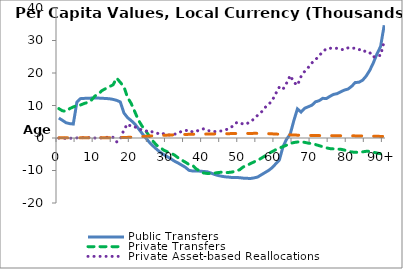
| Category | Public Transfers | Private Transfers | Private Asset-based Reallocations | Public Asset-based Reallocations |
|---|---|---|---|---|
| 0 | 6132.836 | 9041.562 | -36.174 | 38.028 |
|  | 5446.502 | 8375.056 | -2.334 | 40.225 |
| 2 | 4695.357 | 8206.972 | -160.194 | 42.548 |
| 3 | 4424.42 | 9032.658 | -80.09 | 45.016 |
| 4 | 4291.121 | 9559.871 | -36.107 | 47.719 |
| 5 | 11035.01 | 9991.024 | 34.15 | 50.623 |
| 6 | 12115.54 | 10165.3 | 90.466 | 53.706 |
| 7 | 12183.44 | 10608.65 | 118.781 | 56.86 |
| 8 | 12246.9 | 10949.73 | 105.192 | 60.293 |
| 9 | 12271.78 | 11647.49 | 75.593 | 63.993 |
| 10 | 12270.17 | 12912.28 | -10.932 | 68.037 |
| 11 | 12279.18 | 13615.6 | -66.403 | 72.245 |
| 12 | 12223.39 | 14631.22 | 93.791 | 77.092 |
| 13 | 12147.26 | 15214.84 | 142.559 | 81.833 |
| 14 | 12084.44 | 15801.8 | 322.805 | 86.351 |
| 15 | 11872.89 | 16348.94 | 199.904 | 104.993 |
| 16 | 11587.35 | 18432.36 | -1195.591 | 114.671 |
| 17 | 11099.1 | 17126.04 | -388.207 | 129.566 |
| 18 | 7721.324 | 15816.42 | 2551.385 | 153.86 |
| 19 | 6284.614 | 12517 | 4323.899 | 190.759 |
| 20 | 5372.981 | 10675.44 | 3562.29 | 240.366 |
| 21 | 4347.322 | 8136.417 | 3485.711 | 300.034 |
| 22 | 2941.067 | 5535.212 | 2734.768 | 366.129 |
| 23 | 1468.259 | 3701.226 | 2550.877 | 437.795 |
| 24 | 81.21 | 2323.384 | 2308.249 | 512.664 |
| 25 | -1251.313 | 594.807 | 1669.249 | 589.196 |
| 26 | -2385.767 | -892.374 | 1977.53 | 662.428 |
| 27 | -3395.102 | -2170.118 | 1605.242 | 726.257 |
| 28 | -4345.411 | -2877.42 | 1069.456 | 783.099 |
| 29 | -5089.979 | -3724.242 | 1354.254 | 832.714 |
| 30 | -5743.635 | -4247.252 | 922.675 | 879.599 |
| 31 | -6406.949 | -4645.957 | 939.599 | 924.504 |
| 32 | -7123.437 | -5254.156 | 1167.259 | 970.245 |
| 33 | -7692.671 | -6076.954 | 1445.196 | 1013.6 |
| 34 | -8349.506 | -6795.165 | 2103.838 | 1055.821 |
| 35 | -9001.864 | -7444.923 | 2270.438 | 1092.401 |
| 36 | -9943.865 | -8121.749 | 2474.352 | 1124.208 |
| 37 | -10157.79 | -8387.875 | 1821.753 | 1148.448 |
| 38 | -10136.32 | -9501.894 | 2066.802 | 1168.058 |
| 39 | -10197.62 | -10150.07 | 2501.125 | 1180.514 |
| 40 | -10295.53 | -10746.25 | 2809.639 | 1194.461 |
| 41 | -10387.87 | -10909 | 2241.284 | 1211.695 |
| 42 | -10741.25 | -10963.86 | 2250.42 | 1233.616 |
| 43 | -11190.46 | -10801.02 | 1963.238 | 1256.254 |
| 44 | -11520.01 | -10647.53 | 2138.01 | 1281.723 |
| 45 | -11756.88 | -10514.06 | 2156.598 | 1304.64 |
| 46 | -11948.84 | -10689.32 | 2495.003 | 1323.48 |
| 47 | -12028.8 | -10591.72 | 2844.187 | 1340.882 |
| 48 | -12180.47 | -10468.82 | 3572.59 | 1355.415 |
| 49 | -12145.1 | -10116 | 4661.516 | 1369.575 |
| 50 | -12209.45 | -9790.929 | 4847.422 | 1381.102 |
| 51 | -12348.84 | -8908.696 | 4222.916 | 1393.462 |
| 52 | -12407.68 | -8474.81 | 4419.025 | 1403.615 |
| 53 | -12456.5 | -7884.388 | 4986.426 | 1417.943 |
| 54 | -12277.22 | -7353.136 | 5882.1 | 1423.744 |
| 55 | -12013.56 | -6819.694 | 7004.51 | 1422.796 |
| 56 | -11324.19 | -6229.308 | 7932.14 | 1408.599 |
| 57 | -10653.09 | -5522.614 | 9343.586 | 1379.866 |
| 58 | -10006.64 | -4805.598 | 10333.856 | 1332.366 |
| 59 | -9141.15 | -4191.4 | 11457.943 | 1278.035 |
| 60 | -7952.59 | -3608.053 | 13660.419 | 1218.791 |
| 61 | -6777.209 | -3091.362 | 15674.975 | 1151.671 |
| 62 | -2722.359 | -2671.29 | 14979.257 | 1083.689 |
| 63 | -357.974 | -2200.664 | 16881.125 | 1020.482 |
| 64 | 1157.037 | -1638.658 | 19247.981 | 965.492 |
| 65 | 5307.862 | -1402.657 | 17158.638 | 915.824 |
| 66 | 8956.429 | -1228.607 | 16212.887 | 874.16 |
| 67 | 7978.589 | -1144.092 | 18925.532 | 841.231 |
| 68 | 9149.872 | -1352.059 | 20501.302 | 814.48 |
| 69 | 9619.752 | -1569.071 | 21702.732 | 790.283 |
| 70 | 10089.47 | -1750.837 | 23109.381 | 771.614 |
| 71 | 11134.5 | -2014.824 | 24053.376 | 758.477 |
| 72 | 11479.1 | -2354.468 | 25378.336 | 747.402 |
| 73 | 12209.88 | -2674.533 | 26474.89 | 738.093 |
| 74 | 12131.98 | -3034.999 | 27487.306 | 730.021 |
| 75 | 12829.48 | -3268.383 | 27639.251 | 720.674 |
| 76 | 13420.12 | -3344.309 | 27486.723 | 710.212 |
| 77 | 13650.49 | -3414.403 | 27626.042 | 699.021 |
| 78 | 14227.85 | -3473.959 | 27306.734 | 688.296 |
| 79 | 14747.69 | -3697.657 | 27111.012 | 678.48 |
| 80 | 15055.82 | -4040.061 | 27743.596 | 672.038 |
| 81 | 15917.2 | -4314.132 | 27589.435 | 661.508 |
| 82 | 17062.42 | -4395.029 | 27672.378 | 652.318 |
| 83 | 17159.48 | -4397.522 | 27169.913 | 635.592 |
| 84 | 17743.04 | -4271.783 | 27310.62 | 623.684 |
| 85 | 19022.92 | -4103.384 | 26349.87 | 602.218 |
| 86 | 20803.52 | -4113.164 | 26282.573 | 580.084 |
| 87 | 23122.37 | -4366.778 | 24866.239 | 551.413 |
| 88 | 25864.33 | -4628.134 | 25453.941 | 521.402 |
| 89 | 28140.67 | -4839.78 | 25359.348 | 489.557 |
| 90+ | 34690.66 | -4865.684 | 29819.96 | 461.542 |